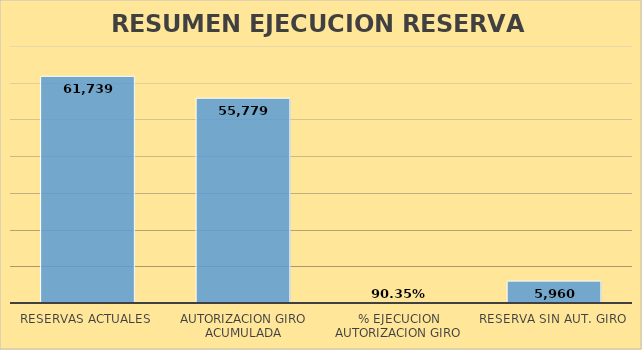
| Category | 3 |
|---|---|
| RESERVAS ACTUALES | 61739.197 |
| AUTORIZACION GIRO ACUMULADA | 55779.37 |
| % EJECUCION AUTORIZACION GIRO | 0.903 |
| RESERVA SIN AUT. GIRO | 5959.827 |